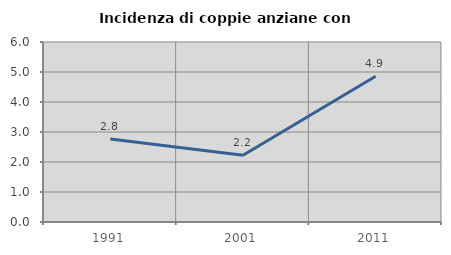
| Category | Incidenza di coppie anziane con figli |
|---|---|
| 1991.0 | 2.769 |
| 2001.0 | 2.222 |
| 2011.0 | 4.858 |